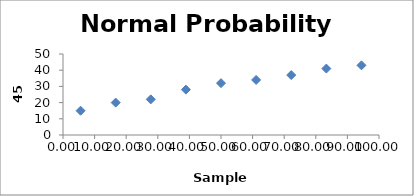
| Category | Series 0 |
|---|---|
| 5.555555555555555 | 15 |
| 16.666666666666664 | 20 |
| 27.77777777777778 | 22 |
| 38.888888888888886 | 28 |
| 50.0 | 32 |
| 61.111111111111114 | 34 |
| 72.22222222222221 | 37 |
| 83.33333333333333 | 41 |
| 94.44444444444444 | 43 |